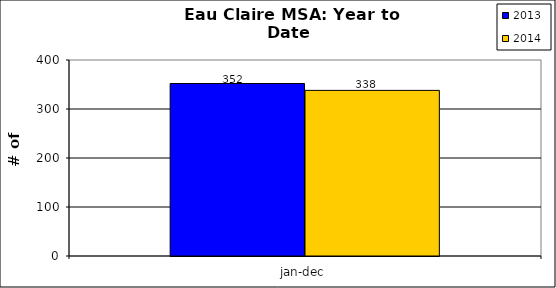
| Category | 2013 | 2014 |
|---|---|---|
| 0 | 352 | 338 |